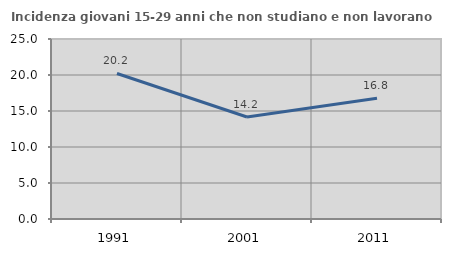
| Category | Incidenza giovani 15-29 anni che non studiano e non lavorano  |
|---|---|
| 1991.0 | 20.213 |
| 2001.0 | 14.167 |
| 2011.0 | 16.757 |